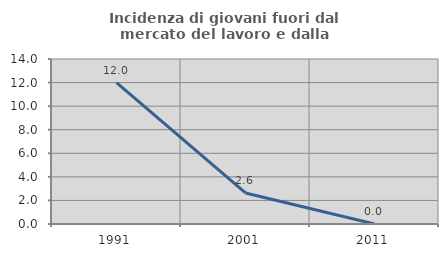
| Category | Incidenza di giovani fuori dal mercato del lavoro e dalla formazione  |
|---|---|
| 1991.0 | 12 |
| 2001.0 | 2.632 |
| 2011.0 | 0 |